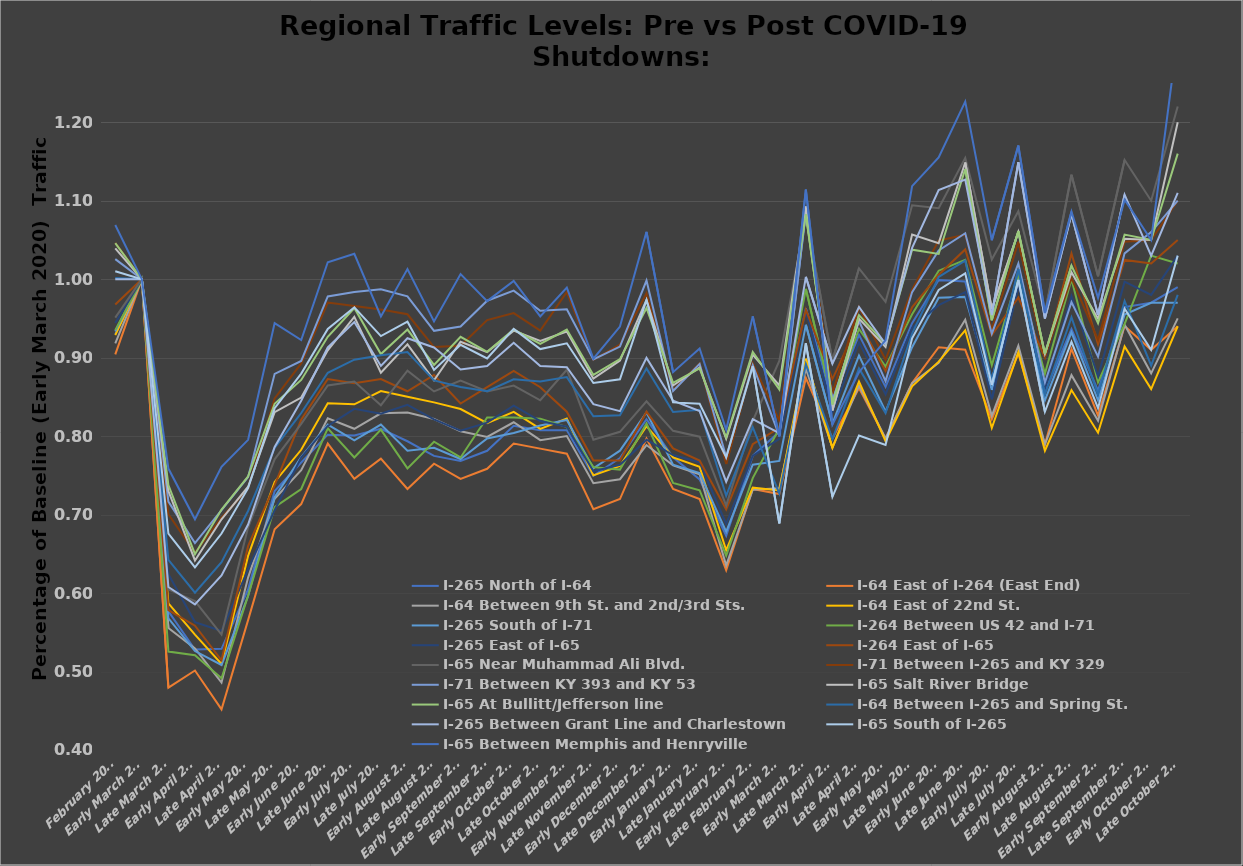
| Category | I-265 | I-64 | I-264 | I-65 | I-71 |
|---|---|---|---|---|---|
| February 2020 | 1 | 1.001 | 0.968 | 1.069 | 1.026 |
| Early March 2020 | 1 | 1 | 1 | 1 | 1 |
| Late March 2020 | 0.608 | 0.642 | 0.578 | 0.759 | 0.717 |
| Early April 2020 | 0.586 | 0.601 | 0.558 | 0.694 | 0.664 |
| Late April 2020 | 0.622 | 0.639 | 0.514 | 0.761 | 0.706 |
| Early May 2020 | 0.687 | 0.705 | 0.66 | 0.795 | 0.748 |
| Late May 2020 | 0.786 | 0.785 | 0.738 | 0.944 | 0.879 |
| Early June 2020 | 0.845 | 0.829 | 0.821 | 0.922 | 0.896 |
| Late June 2020 | 0.913 | 0.881 | 0.873 | 1.022 | 0.978 |
| Early July 2020 | 0.945 | 0.897 | 0.868 | 1.032 | 0.984 |
| Late July 2020 | 0.889 | 0.903 | 0.873 | 0.953 | 0.987 |
| Early August 2020 | 0.925 | 0.907 | 0.857 | 1.013 | 0.978 |
| Late August 2020 | 0.913 | 0.871 | 0.878 | 0.946 | 0.934 |
| Early September 2020 | 0.885 | 0.863 | 0.842 | 1.006 | 0.94 |
| Late September 2020 | 0.889 | 0.857 | 0.862 | 0.972 | 0.973 |
| Early October 2020 | 0.919 | 0.872 | 0.883 | 0.998 | 0.985 |
| Late October 2020 | 0.889 | 0.87 | 0.862 | 0.953 | 0.96 |
| Early November 2020 | 0.888 | 0.875 | 0.831 | 0.989 | 0.962 |
| Late November 2020 | 0.841 | 0.825 | 0.769 | 0.899 | 0.898 |
| Early December 2020 | 0.832 | 0.827 | 0.769 | 0.94 | 0.914 |
| Late December 2020 | 0.9 | 0.886 | 0.831 | 1.06 | 0.998 |
| Early January 2021 | 0.845 | 0.831 | 0.784 | 0.881 | 0.857 |
| Late January 2021 | 0.832 | 0.834 | 0.769 | 0.912 | 0.892 |
| Early February 2021 | 0.742 | 0.724 | 0.706 | 0.808 | 0.773 |
| Late February 2021 | 0.822 | 0.811 | 0.79 | 0.953 | 0.89 |
| Early March 2021 | 0.804 | 0.727 | 0.81 | 0.8 | 0.801 |
| Late March 2021 | 1.003 | 0.892 | 0.961 | 1.114 | 1.086 |
| Early April 2021 | 0.892 | 0.796 | 0.873 | 0.815 | 0.845 |
| Late April 2021 | 0.965 | 0.886 | 0.945 | 0.881 | 0.947 |
| Early May 2021 | 0.917 | 0.829 | 0.883 | 0.922 | 0.87 |
| Late May 2021 | 1.04 | 0.931 | 0.964 | 1.119 | 0.984 |
| Early June 2021 | 1.114 | 1.003 | 1.006 | 1.155 | 1.037 |
| Late June 2021 | 1.127 | 1.024 | 1.038 | 1.226 | 1.059 |
| Early July 2021 | 0.954 | 0.871 | 0.929 | 1.05 | 0.931 |
| Late July 2021 | 1.149 | 1.012 | 0.977 | 1.17 | 1.02 |
| Early August 2021 | 0.95 | 0.853 | 0.9 | 0.957 | 0.868 |
| Late August 2021 | 1.083 | 0.951 | 1.033 | 1.086 | 0.971 |
| Early September 2021 | 0.954 | 0.853 | 0.917 | 0.976 | 0.901 |
| Late September 2021 | 1.108 | 0.972 | 1.025 | 1.101 | 1.033 |
| Early October 2021 | 1.03 | 0.89 | 1.02 | 1.05 | 1.06 |
| Late October 2021 | 1.11 | 0.98 | 1.05 | 1.31 | 1.1 |